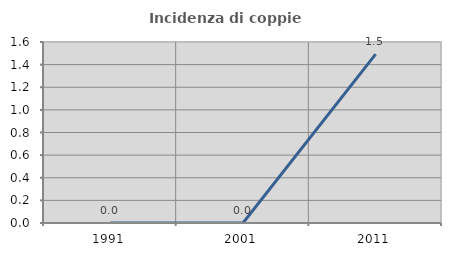
| Category | Incidenza di coppie miste |
|---|---|
| 1991.0 | 0 |
| 2001.0 | 0 |
| 2011.0 | 1.493 |